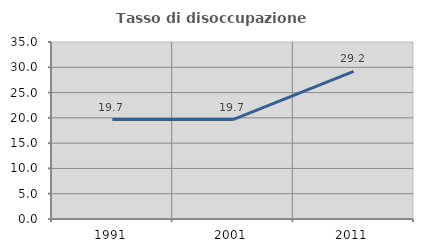
| Category | Tasso di disoccupazione giovanile  |
|---|---|
| 1991.0 | 19.654 |
| 2001.0 | 19.653 |
| 2011.0 | 29.185 |